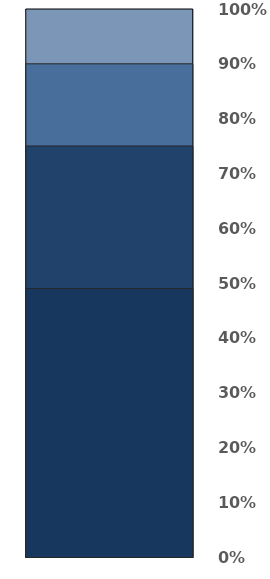
| Category | GOLD:  | SILVER: | CERTIFIED: | NEARLY THERE! |
|---|---|---|---|---|
| 0 | 1 | 0.9 | 0.75 | 0.49 |